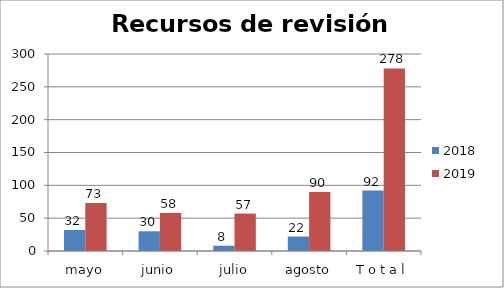
| Category | 2018 | 2019 |
|---|---|---|
| mayo | 32 | 73 |
| junio | 30 | 58 |
| julio | 8 | 57 |
| agosto | 22 | 90 |
| T o t a l | 92 | 278 |